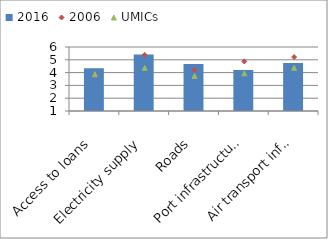
| Category | 2016 |
|---|---|
| Access to loans | 4.34 |
| Electricity supply | 5.414 |
| Roads | 4.671 |
| Port infrastructure | 4.207 |
| Air transport infr. | 4.752 |